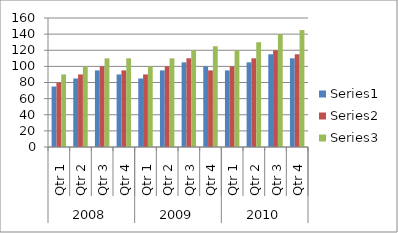
| Category | Series 0 | Series 1 | Series 2 |
|---|---|---|---|
| 0 | 75 | 80 | 90 |
| 1 | 85 | 90 | 100 |
| 2 | 95 | 100 | 110 |
| 3 | 90 | 95 | 110 |
| 4 | 85 | 90 | 100 |
| 5 | 95 | 100 | 110 |
| 6 | 105 | 110 | 120 |
| 7 | 100 | 95 | 125 |
| 8 | 95 | 100 | 120 |
| 9 | 105 | 110 | 130 |
| 10 | 115 | 120 | 140 |
| 11 | 110 | 115 | 145 |